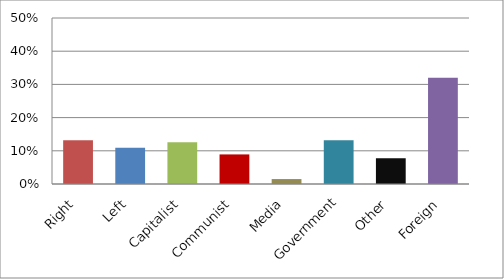
| Category | Series 0 |
|---|---|
| Right | 0.132 |
| Left | 0.109 |
| Capitalist | 0.125 |
| Communist | 0.089 |
| Media | 0.015 |
| Government | 0.132 |
| Other | 0.078 |
| Foreign | 0.32 |